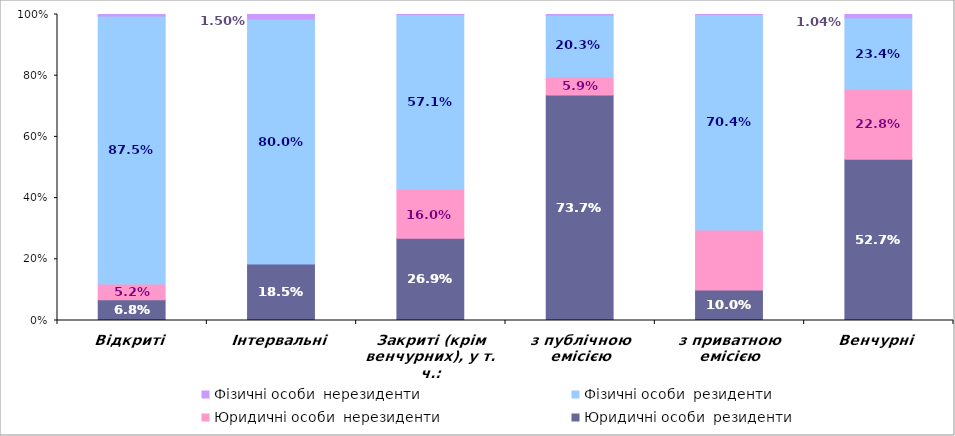
| Category | Юридичні особи  | Фізичні особи  |
|---|---|---|
| Відкриті | 0.052 | 0.005 |
| Інтервальні | 0 | 0.015 |
| Закриті (крім венчурних), у т. ч.: | 0.16 | 0 |
| з публічною емісією | 0.059 | 0.001 |
| з приватною емісією | 0.196 | 0 |
| Венчурні | 0.228 | 0.01 |